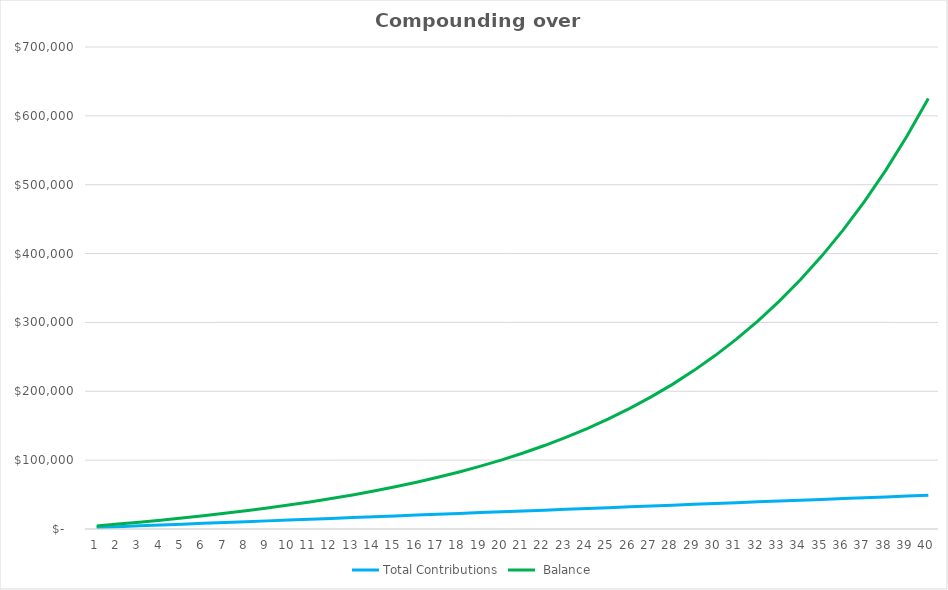
| Category | Total Contributions |  Balance |
|---|---|---|
| 1.0 | 2200 | 2300 |
| 2.0 | 3400 | 3730 |
| 3.0 | 4600 | 5303 |
| 4.0 | 5800 | 7033.3 |
| 5.0 | 7000 | 8936.63 |
| 6.0 | 8200 | 11030.293 |
| 7.0 | 9400 | 13333.322 |
| 8.0 | 10600 | 15866.655 |
| 9.0 | 11800 | 18653.32 |
| 10.0 | 13000 | 21718.652 |
| 11.0 | 14200 | 25090.517 |
| 12.0 | 15400 | 28799.569 |
| 13.0 | 16600 | 32879.526 |
| 14.0 | 17800 | 37367.478 |
| 15.0 | 19000 | 42304.226 |
| 16.0 | 20200 | 47734.649 |
| 17.0 | 21400 | 53708.114 |
| 18.0 | 22600 | 60278.925 |
| 19.0 | 23800 | 67506.818 |
| 20.0 | 25000 | 75457.499 |
| 21.0 | 26200 | 84203.249 |
| 22.0 | 27400 | 93823.574 |
| 23.0 | 28600 | 104405.932 |
| 24.0 | 29800 | 116046.525 |
| 25.0 | 31000 | 128851.177 |
| 26.0 | 32200 | 142936.295 |
| 27.0 | 33400 | 158429.924 |
| 28.0 | 34600 | 175472.917 |
| 29.0 | 35800 | 194220.209 |
| 30.0 | 37000 | 214842.229 |
| 31.0 | 38200 | 237526.452 |
| 32.0 | 39400 | 262479.098 |
| 33.0 | 40600 | 289927.007 |
| 34.0 | 41800 | 320119.708 |
| 35.0 | 43000 | 353331.679 |
| 36.0 | 44200 | 389864.847 |
| 37.0 | 45400 | 430051.332 |
| 38.0 | 46600 | 474256.465 |
| 39.0 | 47800 | 522882.111 |
| 40.0 | 49000 | 576370.322 |